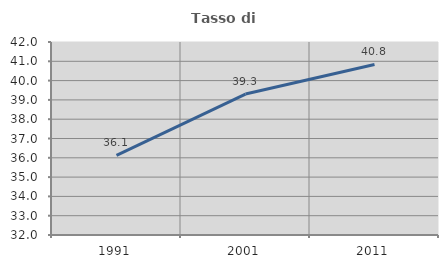
| Category | Tasso di occupazione   |
|---|---|
| 1991.0 | 36.129 |
| 2001.0 | 39.302 |
| 2011.0 | 40.837 |